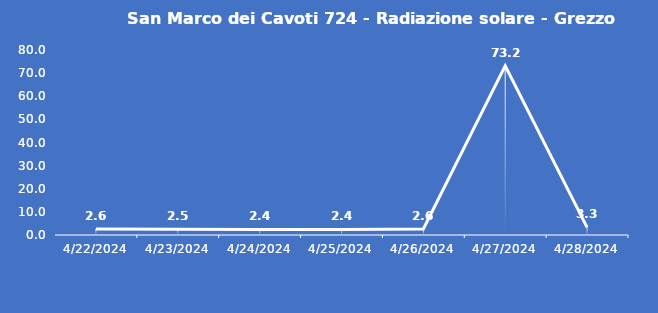
| Category | San Marco dei Cavoti 724 - Radiazione solare - Grezzo (W/m2) |
|---|---|
| 4/22/24 | 2.6 |
| 4/23/24 | 2.5 |
| 4/24/24 | 2.4 |
| 4/25/24 | 2.4 |
| 4/26/24 | 2.6 |
| 4/27/24 | 73.2 |
| 4/28/24 | 3.3 |